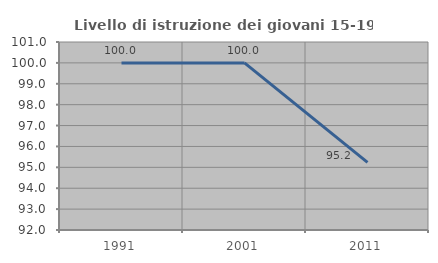
| Category | Livello di istruzione dei giovani 15-19 anni |
|---|---|
| 1991.0 | 100 |
| 2001.0 | 100 |
| 2011.0 | 95.238 |